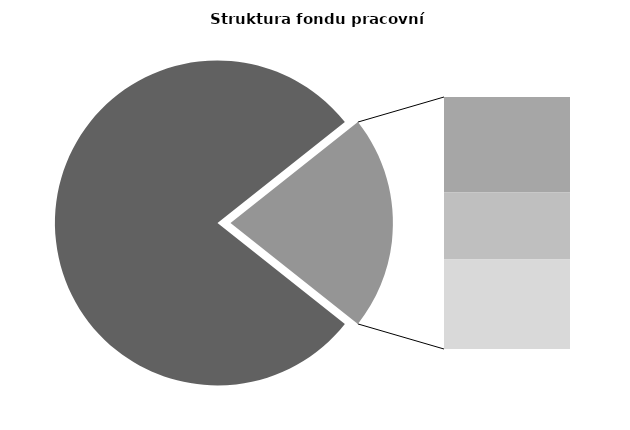
| Category | Series 0 |
|---|---|
| Průměrná měsíční odpracovaná doba bez přesčasu | 134.09 |
| Dovolená | 13.787 |
| Nemoc | 9.663 |
| Jiné | 12.907 |